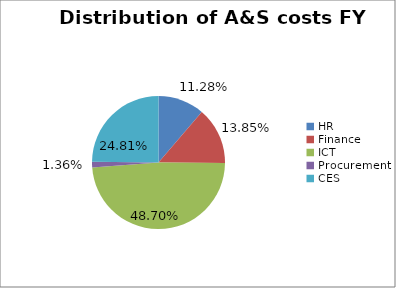
| Category | Distribution of A&S costs FY 2011/12 |
|---|---|
| HR | 0.113 |
| Finance | 0.138 |
| ICT | 0.487 |
| Procurement | 0.014 |
| CES | 0.248 |